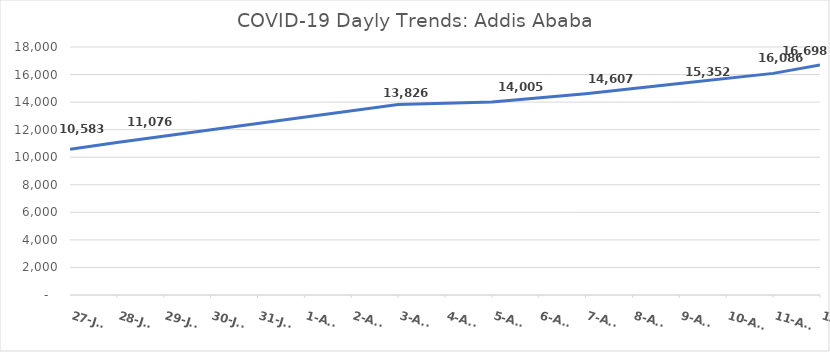
| Category | Addis Ababa |
|---|---|
| 2020-07-27 | 10583 |
| 2020-07-28 | 11076 |
| 2020-08-03 | 13826 |
| 2020-08-05 | 14005 |
| 2020-08-07 | 14607 |
| 2020-08-09 | 15352 |
| 2020-08-11 | 16086 |
| 2020-08-12 | 16698 |